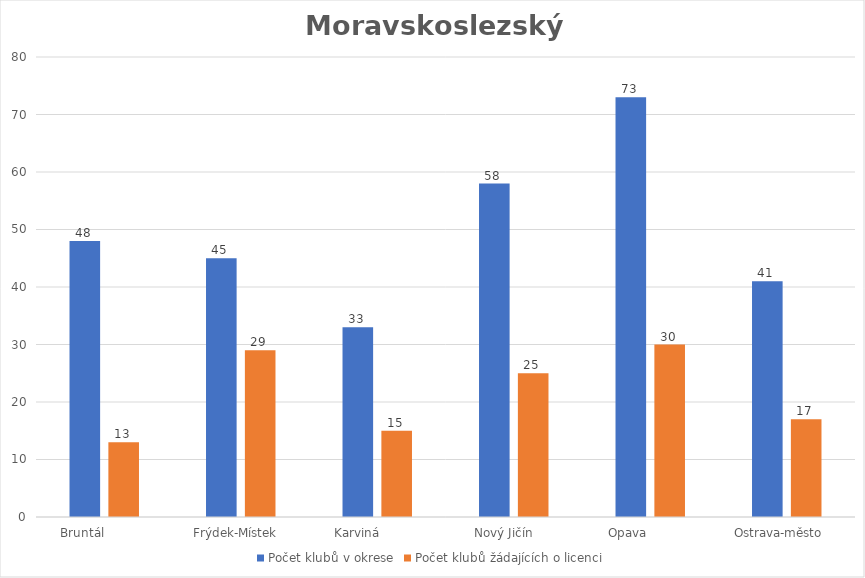
| Category | Počet klubů v okrese | Počet klubů žádajících o licenci |
|---|---|---|
| Bruntál            | 48 | 13 |
| Frýdek-Místek   | 45 | 29 |
| Karviná           | 33 | 15 |
| Nový Jičín     | 58 | 25 |
| Opava            | 73 | 30 |
| Ostrava-město    | 41 | 17 |